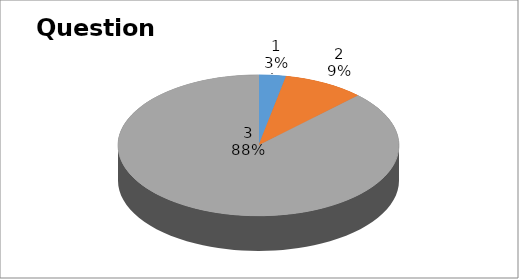
| Category | Series 0 |
|---|---|
| 0 | 1 |
| 1 | 3 |
| 2 | 28 |